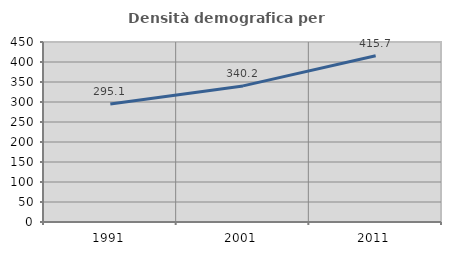
| Category | Densità demografica |
|---|---|
| 1991.0 | 295.134 |
| 2001.0 | 340.245 |
| 2011.0 | 415.708 |